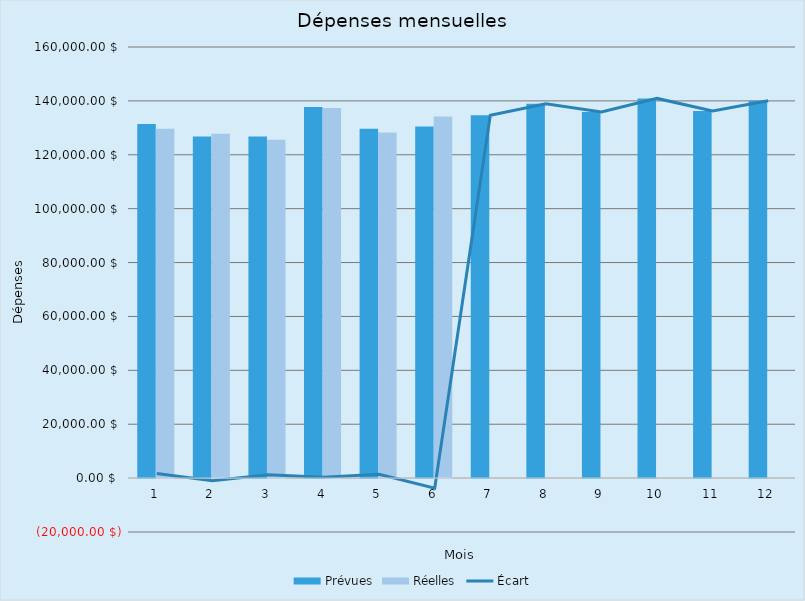
| Category | Prévues | Réelles |
|---|---|---|
| 0 | 131420 | 129682 |
| 1 | 126820 | 127804 |
| 2 | 126820 | 125565 |
| 3 | 137695 | 137394 |
| 4 | 129695 | 128255 |
| 5 | 130495 | 134239 |
| 6 | 134695 | 0 |
| 7 | 138918 | 0 |
| 8 | 135918 | 0 |
| 9 | 140918 | 0 |
| 10 | 136218 | 0 |
| 11 | 140018 | 0 |